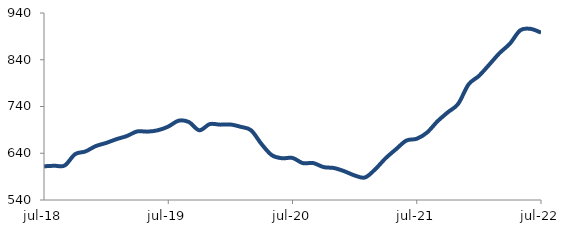
| Category | Series 0 |
|---|---|
| 2018-07-01 | 612.121 |
| 2018-08-01 | 613.247 |
| 2018-09-01 | 613.821 |
| 2018-10-01 | 638.011 |
| 2018-11-01 | 643.807 |
| 2018-12-01 | 655.34 |
| 2019-01-01 | 662.041 |
| 2019-02-01 | 670.134 |
| 2019-03-01 | 676.827 |
| 2019-04-01 | 686.669 |
| 2019-05-01 | 686.255 |
| 2019-06-01 | 689.181 |
| 2019-07-01 | 697.076 |
| 2019-08-01 | 709.635 |
| 2019-09-01 | 706.734 |
| 2019-10-01 | 689.137 |
| 2019-11-01 | 702.277 |
| 2019-12-01 | 701.214 |
| 2020-01-01 | 701.517 |
| 2020-02-01 | 696.552 |
| 2020-03-01 | 689.099 |
| 2020-04-01 | 659.896 |
| 2020-05-01 | 635.894 |
| 2020-06-01 | 629.29 |
| 2020-07-01 | 629.994 |
| 2020-08-01 | 618.866 |
| 2020-09-01 | 619.022 |
| 2020-10-01 | 610.428 |
| 2020-11-01 | 608.402 |
| 2020-12-01 | 601.605 |
| 2021-01-01 | 592.504 |
| 2021-02-01 | 588.185 |
| 2021-03-01 | 605.989 |
| 2021-04-01 | 629.446 |
| 2021-05-01 | 648.73 |
| 2021-06-01 | 667.177 |
| 2021-07-01 | 670.996 |
| 2021-08-01 | 684.389 |
| 2021-09-01 | 708.308 |
| 2021-10-01 | 727.608 |
| 2021-11-01 | 745.65 |
| 2021-12-01 | 787.184 |
| 2022-01-01 | 805.308 |
| 2022-02-01 | 829.502 |
| 2022-03-01 | 854.336 |
| 2022-04-01 | 874.453 |
| 2022-05-01 | 903.049 |
| 2022-06-01 | 906.022 |
| 2022-07-01 | 898.071 |